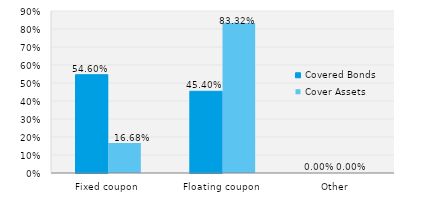
| Category | Covered Bonds | Cover Assets |
|---|---|---|
| Fixed coupon | 0.546 | 0.167 |
| Floating coupon | 0.454 | 0.833 |
| Other | 0 | 0 |